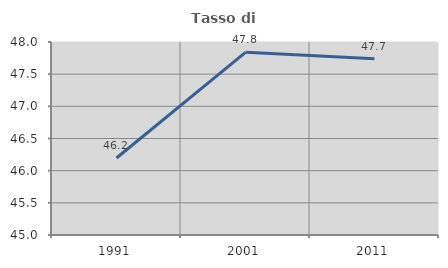
| Category | Tasso di occupazione   |
|---|---|
| 1991.0 | 46.197 |
| 2001.0 | 47.839 |
| 2011.0 | 47.74 |